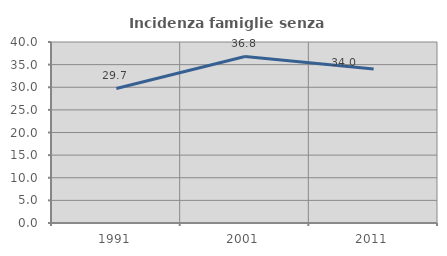
| Category | Incidenza famiglie senza nuclei |
|---|---|
| 1991.0 | 29.73 |
| 2001.0 | 36.808 |
| 2011.0 | 34.018 |